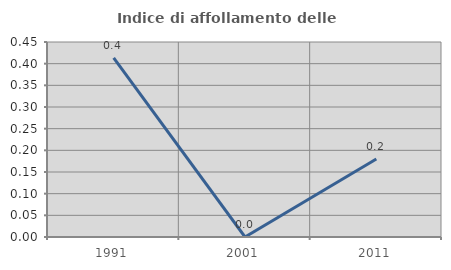
| Category | Indice di affollamento delle abitazioni  |
|---|---|
| 1991.0 | 0.413 |
| 2001.0 | 0 |
| 2011.0 | 0.18 |